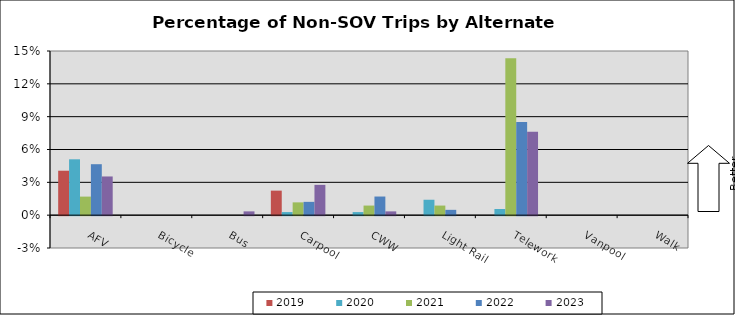
| Category | 2019 | 2020 | 2021 | 2022 | 2023 |
|---|---|---|---|---|---|
| AFV | 0.041 | 0.051 | 0.017 | 0.047 | 0.035 |
| Bicycle | 0 | 0 | 0 | 0 | 0 |
| Bus | 0 | 0 | 0 | 0 | 0.003 |
| Carpool | 0.022 | 0.003 | 0.012 | 0.012 | 0.028 |
| CWW | 0 | 0.003 | 0.009 | 0.017 | 0.003 |
| Light Rail | 0 | 0.014 | 0.009 | 0.005 | 0 |
| Telework | 0 | 0.006 | 0.143 | 0.085 | 0.076 |
| Vanpool | 0 | 0 | 0 | 0 | 0 |
| Walk | 0 | 0 | 0 | 0 | 0 |